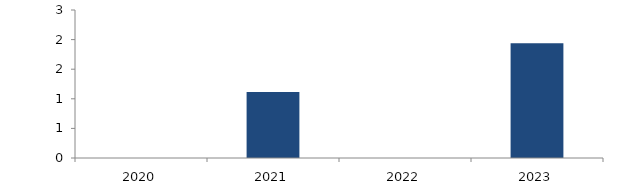
| Category | Bogotá |
|---|---|
| 2020.0 | 0 |
| 2021.0 | 1.116 |
| 2022.0 | 0 |
| 2023.0 | 1.937 |